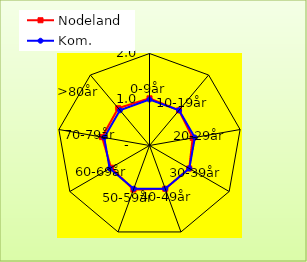
| Category | Nodeland | Kom. |
|---|---|---|
| 0-9år | 1.026 | 1 |
| 10-19år | 0.998 | 1 |
| 20-29år | 0.952 | 1 |
| 30-39år | 0.997 | 1 |
| 40-49år | 1.001 | 1 |
| 50-59år | 1.02 | 1 |
| 60-69år | 0.965 | 1 |
| 70-79år | 1.048 | 1 |
| >80år | 1.059 | 1 |